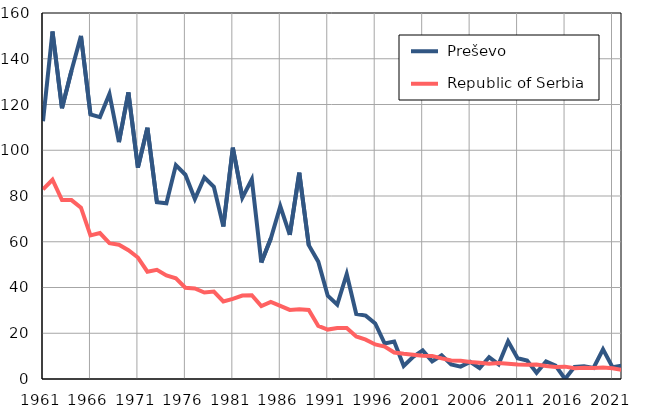
| Category |  Preševo |  Republic of Serbia |
|---|---|---|
| 1961.0 | 112.7 | 82.9 |
| 1962.0 | 151.9 | 87.1 |
| 1963.0 | 118.4 | 78.2 |
| 1964.0 | 134.8 | 78.2 |
| 1965.0 | 150 | 74.9 |
| 1966.0 | 115.7 | 62.8 |
| 1967.0 | 114.5 | 63.8 |
| 1968.0 | 124.6 | 59.4 |
| 1969.0 | 103.6 | 58.7 |
| 1970.0 | 125.3 | 56.3 |
| 1971.0 | 92.4 | 53.1 |
| 1972.0 | 109.8 | 46.9 |
| 1973.0 | 77.3 | 47.7 |
| 1974.0 | 76.8 | 45.3 |
| 1975.0 | 93.5 | 44 |
| 1976.0 | 89.3 | 39.9 |
| 1977.0 | 78.7 | 39.6 |
| 1978.0 | 88.1 | 37.8 |
| 1979.0 | 84 | 38.2 |
| 1980.0 | 66.7 | 33.9 |
| 1981.0 | 101.1 | 35 |
| 1982.0 | 79.3 | 36.5 |
| 1983.0 | 87.3 | 36.6 |
| 1984.0 | 50.9 | 31.9 |
| 1985.0 | 61.4 | 33.7 |
| 1986.0 | 75.5 | 32 |
| 1987.0 | 63 | 30.2 |
| 1988.0 | 90.2 | 30.5 |
| 1989.0 | 58.5 | 30.2 |
| 1990.0 | 51.3 | 23.2 |
| 1991.0 | 36.4 | 21.6 |
| 1992.0 | 32.5 | 22.3 |
| 1993.0 | 45.9 | 22.3 |
| 1994.0 | 28.4 | 18.6 |
| 1995.0 | 27.7 | 17.2 |
| 1996.0 | 24.3 | 15.1 |
| 1997.0 | 15.5 | 14.2 |
| 1998.0 | 16.4 | 11.6 |
| 1999.0 | 5.7 | 11 |
| 2000.0 | 9.7 | 10.6 |
| 2001.0 | 12.5 | 10.2 |
| 2002.0 | 7.7 | 10.1 |
| 2003.0 | 10.4 | 9 |
| 2004.0 | 6.4 | 8.1 |
| 2005.0 | 5.4 | 8 |
| 2006.0 | 7.5 | 7.4 |
| 2007.0 | 4.8 | 7.1 |
| 2008.0 | 9.5 | 6.7 |
| 2009.0 | 6.4 | 7 |
| 2010.0 | 16.5 | 6.7 |
| 2011.0 | 9.1 | 6.3 |
| 2012.0 | 8.1 | 6.2 |
| 2013.0 | 2.7 | 6.3 |
| 2014.0 | 7.7 | 5.7 |
| 2015.0 | 5.9 | 5.3 |
| 2016.0 | 0 | 5.4 |
| 2017.0 | 5.3 | 4.7 |
| 2018.0 | 5.6 | 4.9 |
| 2019.0 | 4.8 | 4.8 |
| 2020.0 | 13 | 5 |
| 2021.0 | 5.2 | 4.7 |
| 2022.0 | 5.8 | 4 |